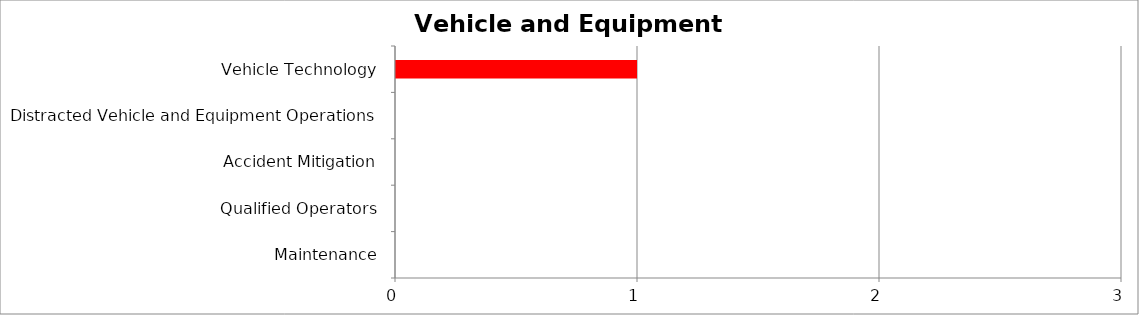
| Category | Low | Medium | High |
|---|---|---|---|
| Maintenance | 0 | 0 | 0 |
| Qualified Operators | 0 | 0 | 0 |
| Accident Mitigation | 0 | 0 | 0 |
| Distracted Vehicle and Equipment Operations | 0 | 0 | 0 |
| Vehicle Technology | 0 | 0 | 1 |